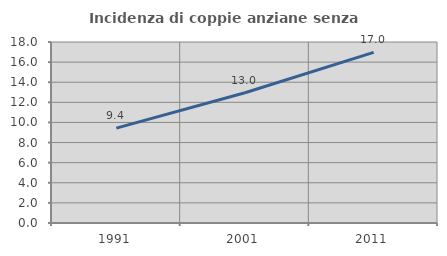
| Category | Incidenza di coppie anziane senza figli  |
|---|---|
| 1991.0 | 9.436 |
| 2001.0 | 12.953 |
| 2011.0 | 16.974 |